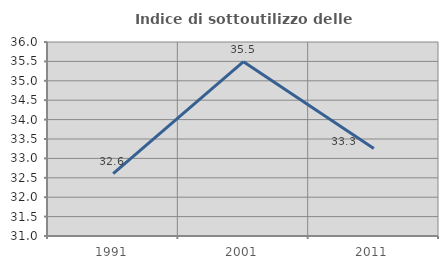
| Category | Indice di sottoutilizzo delle abitazioni  |
|---|---|
| 1991.0 | 32.609 |
| 2001.0 | 35.494 |
| 2011.0 | 33.254 |